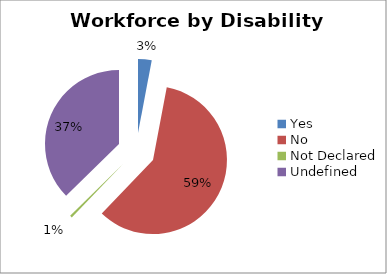
| Category | Series 0 |
|---|---|
| Yes | 2.979 |
| No | 59.196 |
| Not Declared | 0.502 |
| Undefined | 37.323 |